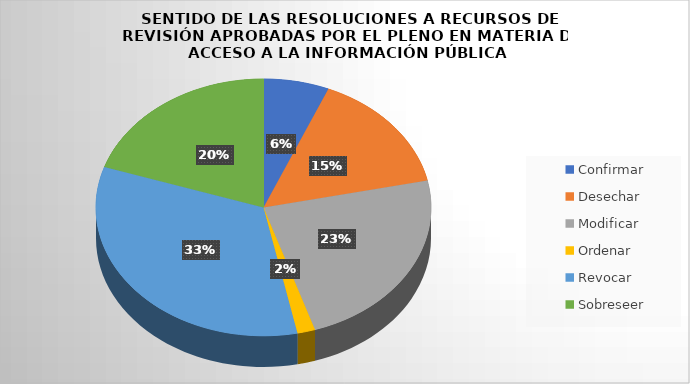
| Category | Series 0 |
|---|---|
| Confirmar | 154 |
| Desechar | 373 |
| Modificar | 570 |
| Ordenar | 42 |
| Revocar | 812 |
| Sobreseer | 485 |